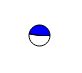
| Category | Series 0 |
|---|---|
| 0 | 4058033 |
| 1 | 3682009 |